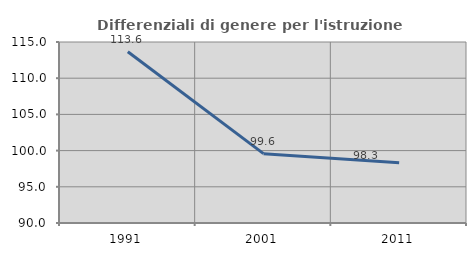
| Category | Differenziali di genere per l'istruzione superiore |
|---|---|
| 1991.0 | 113.644 |
| 2001.0 | 99.578 |
| 2011.0 | 98.333 |